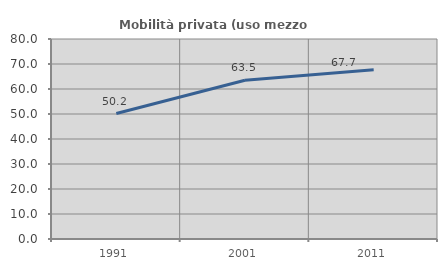
| Category | Mobilità privata (uso mezzo privato) |
|---|---|
| 1991.0 | 50.187 |
| 2001.0 | 63.519 |
| 2011.0 | 67.668 |